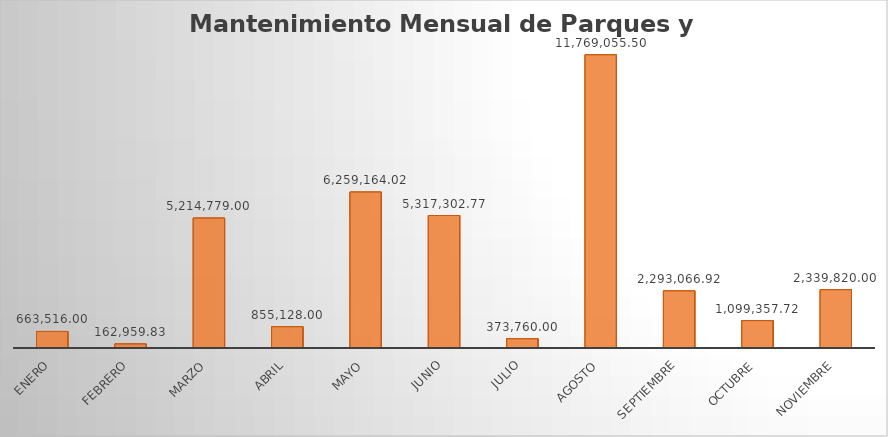
| Category | Monto |
|---|---|
| ENERO | 663516 |
| FEBRERO | 162959.83 |
| MARZO | 5214779 |
| ABRIL | 855128 |
| MAYO | 6259164.02 |
| JUNIO | 5317302.77 |
| JULIO | 373760 |
| AGOSTO | 11769055.5 |
| SEPTIEMBRE | 2293066.92 |
| OCTUBRE | 1099357.72 |
| NOVIEMBRE | 2339820 |